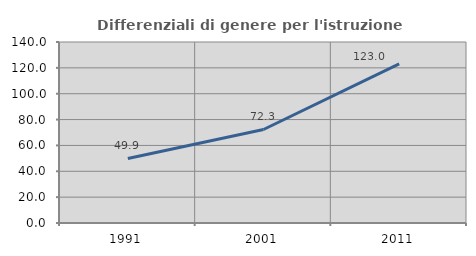
| Category | Differenziali di genere per l'istruzione superiore |
|---|---|
| 1991.0 | 49.926 |
| 2001.0 | 72.32 |
| 2011.0 | 123.01 |